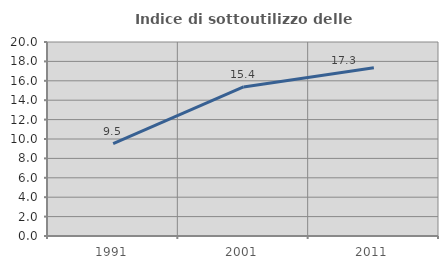
| Category | Indice di sottoutilizzo delle abitazioni  |
|---|---|
| 1991.0 | 9.524 |
| 2001.0 | 15.363 |
| 2011.0 | 17.337 |